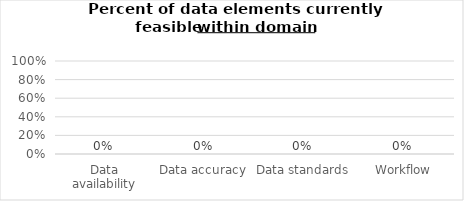
| Category | Percent of data elements currently feasible within domain across sites |
|---|---|
| Data availability | 0 |
| Data accuracy | 0 |
| Data standards | 0 |
| Workflow | 0 |